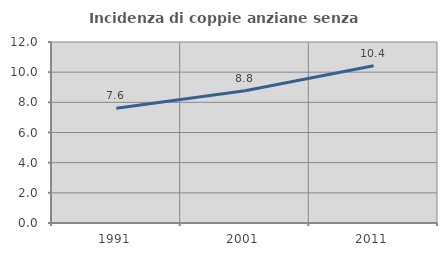
| Category | Incidenza di coppie anziane senza figli  |
|---|---|
| 1991.0 | 7.606 |
| 2001.0 | 8.763 |
| 2011.0 | 10.429 |